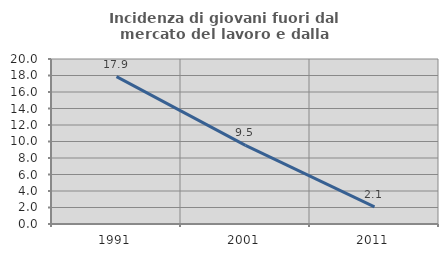
| Category | Incidenza di giovani fuori dal mercato del lavoro e dalla formazione  |
|---|---|
| 1991.0 | 17.857 |
| 2001.0 | 9.524 |
| 2011.0 | 2.083 |